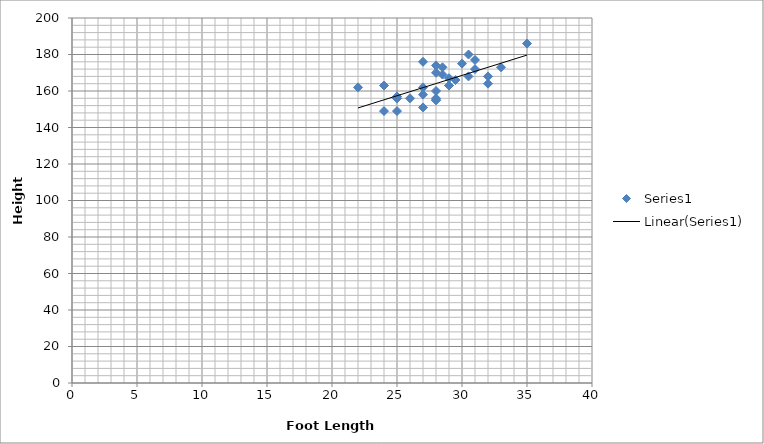
| Category | Series 0 |
|---|---|
| 33.0 | 173 |
| 25.0 | 156 |
| 28.0 | 155 |
| 31.0 | 172 |
| 29.5 | 166 |
| 30.5 | 180 |
| 28.0 | 170 |
| 29.0 | 163 |
| 25.0 | 156 |
| 26.0 | 156 |
| 28.0 | 155 |
| 28.0 | 156 |
| 28.5 | 173 |
| 28.0 | 160 |
| 30.5 | 168 |
| 29.0 | 163 |
| 25.0 | 157 |
| 27.0 | 151 |
| 28.0 | 174 |
| 27.0 | 162 |
| 30.0 | 175 |
| 28.5 | 169 |
| 24.0 | 163 |
| 25.0 | 149 |
| 27.0 | 176 |
| 27.0 | 158 |
| 24.0 | 149 |
| 32.0 | 168 |
| 22.0 | 162 |
| 29.0 | 167 |
| 31.0 | 177 |
| 32.0 | 164 |
| 35.0 | 186 |